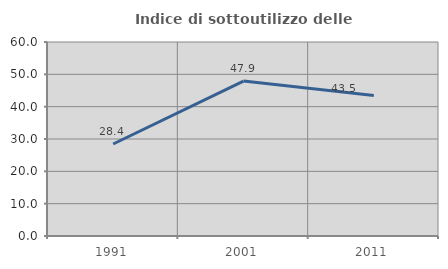
| Category | Indice di sottoutilizzo delle abitazioni  |
|---|---|
| 1991.0 | 28.448 |
| 2001.0 | 47.917 |
| 2011.0 | 43.478 |